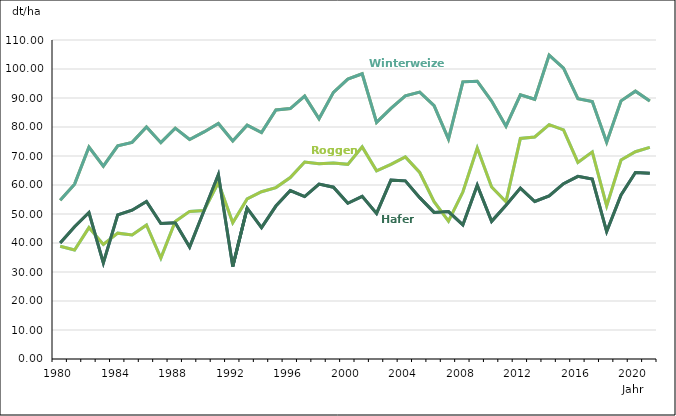
| Category | Winterweizen | Roggen  | Hafer |
|---|---|---|---|
| 1980.0 | 54.76 | 38.9 | 40 |
| 1981.0 | 60.3 | 37.6 | 45.6 |
| 1982.0 | 73.1 | 45.3 | 50.5 |
| 1983.0 | 66.5 | 39.5 | 33.1 |
| 1984.0 | 73.5 | 43.4 | 49.7 |
| 1985.0 | 74.7 | 42.8 | 51.3 |
| 1986.0 | 80 | 46.2 | 54.3 |
| 1987.0 | 74.6 | 34.8 | 46.7 |
| 1988.0 | 79.6 | 47.4 | 47 |
| 1989.0 | 75.7 | 50.9 | 38.6 |
| 1990.0 | 78.3 | 51.2 | 51.1 |
| 1991.0 | 81.2 | 60.8 | 63.6 |
| 1992.0 | 75.2 | 47 | 31.9 |
| 1993.0 | 80.63 | 55.22 | 52.01 |
| 1994.0 | 78.11 | 57.69 | 45.32 |
| 1995.0 | 85.86 | 59.11 | 52.74 |
| 1996.0 | 86.37 | 62.56 | 58.1 |
| 1997.0 | 90.66 | 67.91 | 56.01 |
| 1998.0 | 82.83 | 67.31 | 60.33 |
| 1999.0 | 91.95 | 67.59 | 59.23 |
| 2000.0 | 96.51 | 67.12 | 53.7 |
| 2001.0 | 98.35 | 73.15 | 56.08 |
| 2002.0 | 81.58 | 64.87 | 50.22 |
| 2003.0 | 86.44 | 67.11 | 61.67 |
| 2004.0 | 90.74 | 69.7 | 61.43 |
| 2005.0 | 92.01 | 64.32 | 55.65 |
| 2006.0 | 87.4 | 54.24 | 50.55 |
| 2007.0 | 75.82 | 47.53 | 50.82 |
| 2008.0 | 95.56 | 57.57 | 46.23 |
| 2009.0 | 95.8 | 72.73 | 59.94 |
| 2010.0 | 88.93 | 59.33 | 47.46 |
| 2011.0 | 80.26 | 54.22 | 53.03 |
| 2012.0 | 91.08 | 76.06 | 58.94 |
| 2013.0 | 89.56 | 76.55 | 54.31 |
| 2014.0 | 104.79 | 80.83 | 56.23 |
| 2015.0 | 100.29 | 78.98 | 60.47 |
| 2016.0 | 89.75 | 67.8 | 62.97 |
| 2017.0 | 88.78 | 71.41 | 62.05 |
| 2018.0 | 74.72 | 52.81 | 43.94 |
| 2019.0 | 89.01 | 68.61 | 56.56 |
| 2020.0 | 92.35 | 71.48 | 64.3 |
| 2021.0 | 88.94 | 72.96 | 64.01 |